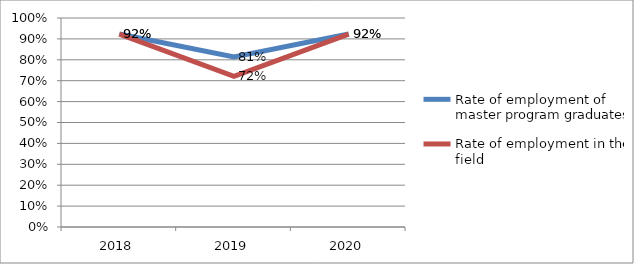
| Category | Rate of employment of master program graduates | Rate of employment in the field |
|---|---|---|
| 2018.0 | 0.923 | 0.923 |
| 2019.0 | 0.814 | 0.721 |
| 2020.0 | 0.923 | 0.923 |